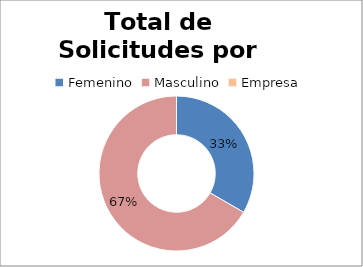
| Category | Series 0 |
|---|---|
| 0 | 1 |
| 1 | 2 |
| 2 | 0 |